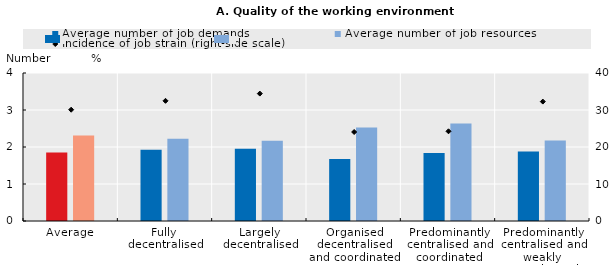
| Category | Average number of job demands | Average number of job resources |
|---|---|---|
| Average | 1.855 | 2.308 |
| Fully decentralised | 1.929 | 2.224 |
| Largely decentralised | 1.952 | 2.166 |
| Organised decentralised and coordinated | 1.678 | 2.525 |
| Predominantly centralised and coordinated | 1.837 | 2.636 |
| Predominantly centralised and weakly co-ordinated | 1.877 | 2.178 |